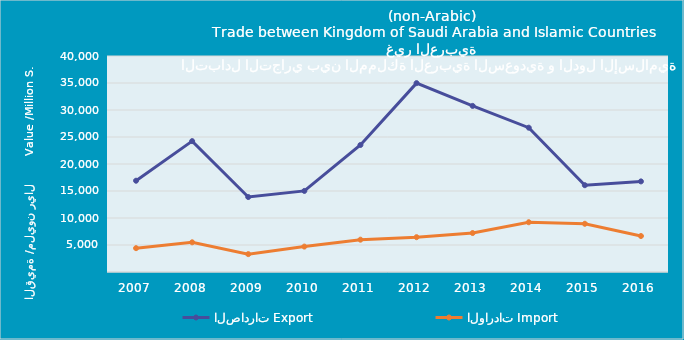
| Category | الصادرات | الواردات |
|---|---|---|
| 2007.0 | 16904324416 | 4416237405 |
| 2008.0 | 24235880882 | 5497959142 |
| 2009.0 | 13880800676 | 3311481165 |
| 2010.0 | 15013169940 | 4706256055 |
| 2011.0 | 23524019509 | 5985787992 |
| 2012.0 | 34973824101 | 6446689147 |
| 2013.0 | 30758464509 | 7215889024 |
| 2014.0 | 26725079028 | 9215043999 |
| 2015.0 | 16073042059 | 8929444542 |
| 2016.0 | 16777216326 | 6663097393 |